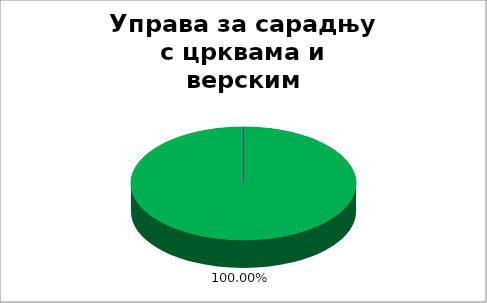
| Category | Управа за сарадњу с црквама и верским заједницама |
|---|---|
| 0 | 1 |
| 1 | 0 |
| 2 | 0 |
| 3 | 0 |
| 4 | 0 |